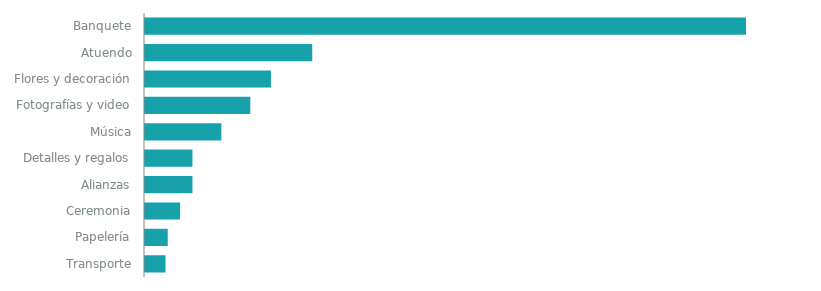
| Category | COSTO ESTIMADO |
|---|---|
| Banquete | 14500 |
| Atuendo | 4000 |
| Flores y decoración | 3000 |
| Fotografías y video | 2500 |
| Música | 1800 |
| Detalles y regalos | 1100 |
| Alianzas | 1100 |
| Ceremonia | 800 |
| Papelería | 500 |
| Transporte | 450 |